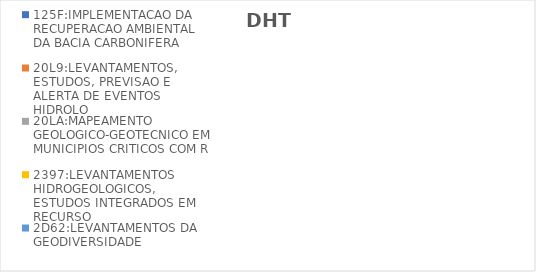
| Category | 125F:IMPLEMENTACAO DA RECUPERACAO AMBIENTAL DA BACIA CARBONIFERA | 20L9:LEVANTAMENTOS, ESTUDOS, PREVISAO E ALERTA DE EVENTOS HIDROLO | 20LA:MAPEAMENTO GEOLOGICO-GEOTECNICO EM MUNICIPIOS CRITICOS COM R | 2397:LEVANTAMENTOS HIDROGEOLOGICOS, ESTUDOS INTEGRADOS EM RECURSO | 2D62:LEVANTAMENTOS DA GEODIVERSIDADE |
|---|---|---|---|---|---|
| EXECUTADO | 0.043 | 0.13 | 0.174 | 0.166 | 0.279 |